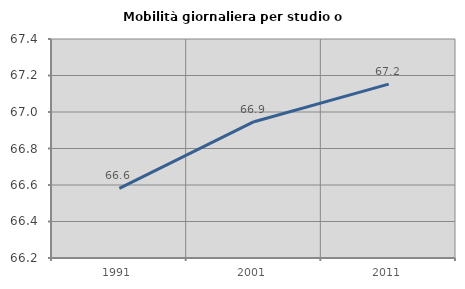
| Category | Mobilità giornaliera per studio o lavoro |
|---|---|
| 1991.0 | 66.581 |
| 2001.0 | 66.947 |
| 2011.0 | 67.153 |